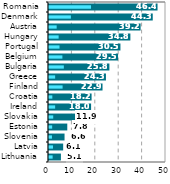
| Category |  Total |
|---|---|
| Lithuania | 5.089 |
| Latvia | 6.054 |
| Slovenia | 6.643 |
| Estonia | 7.812 |
| Slovakia | 11.919 |
| Ireland | 17.988 |
| Croatia | 18.2 |
| Finland | 22.877 |
| Greece | 24.337 |
| Bulgaria | 25.81 |
| Belgium | 29.506 |
| Portugal | 30.527 |
| Hungary | 34.777 |
| Austria | 39.154 |
| Denmark | 44.339 |
| Romania | 46.384 |